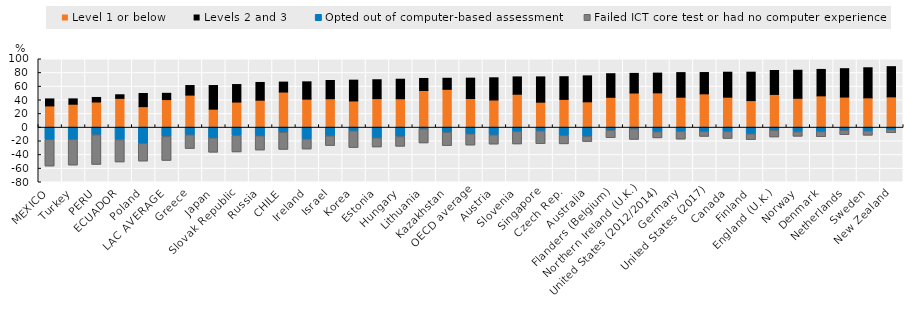
| Category | Level 1 or below | Levels 2 and 3 | Opted out of computer-based assessment | Failed ICT core test or had no computer experience |
|---|---|---|---|---|
| MEXICO | 32.088 | 10.214 | -17.819 | -39.255 |
| Turkey | 34.573 | 7.792 | -17.661 | -37.97 |
| PERU | 37.827 | 6.611 | -11.103 | -43.564 |
| ECUADOR | 43.147 | 5.24 | -18.128 | -32.928 |
| Poland | 31.018 | 19.205 | -23.783 | -25.974 |
| LAC AVERAGE  | 41.357 | 9.154 | -13.633 | -35.236 |
| Greece | 47.888 | 14.003 | -11.224 | -20.214 |
| Japan | 27.315 | 34.585 | -15.909 | -20.935 |
| Slovak Republic | 37.712 | 25.629 | -12.201 | -24.177 |
| Russia | 40.48 | 25.935 | -12.801 | -20.784 |
| CHILE | 52.365 | 14.551 | -7.483 | -25.199 |
| Ireland | 42.011 | 25.291 | -17.417 | -14.729 |
| Israel | 42.659 | 26.625 | -12.707 | -14.344 |
| Korea | 39.352 | 30.409 | -5.393 | -24.578 |
| Estonia | 42.806 | 27.555 | -15.794 | -13.338 |
| Hungary | 42.639 | 28.491 | -13.738 | -14.416 |
| Lithuania | 54.633 | 17.621 | -2.344 | -20.899 |
| Kazakhstan | 56.384 | 16.154 | -7.469 | -19.675 |
| OECD average | 42.955 | 29.745 | -10.011 | -16.34 |
| Austria | 40.758 | 32.468 | -11.252 | -13.671 |
| Slovenia | 49.173 | 25.356 | -6.313 | -18.403 |
| Singapore | 37.532 | 37.029 | -5.53 | -18.857 |
| Czech Rep. | 41.672 | 33.144 | -12.051 | -12.497 |
| Australia | 38.08 | 37.97 | -13.714 | -7.496 |
| Flanders (Belgium) | 44.691 | 34.51 | -4.688 | -10.901 |
| Northern Ireland (U.K.) | 50.969 | 28.732 | -2.271 | -15.817 |
| United States (2012/2014) | 51.198 | 28.896 | -6.62 | -9.174 |
| Germany | 44.833 | 35.976 | -6.051 | -11.607 |
| United States (2017) | 49.769 | 31.151 | -6.286 | -7.42 |
| Canada | 44.827 | 36.557 | -6.302 | -10.378 |
| Finland | 39.882 | 41.561 | -9.72 | -8.712 |
| England (U.K.) | 48.913 | 34.978 | -4.562 | -9.934 |
| Norway | 43.266 | 40.98 | -6.655 | -6.853 |
| Denmark | 46.806 | 38.672 | -6.363 | -7.768 |
| Netherlands | 45.024 | 41.534 | -4.492 | -6.657 |
| Sweden | 43.909 | 43.98 | -5.662 | -6.351 |
| New Zealand | 45.337 | 44.188 | -3.41 | -4.922 |